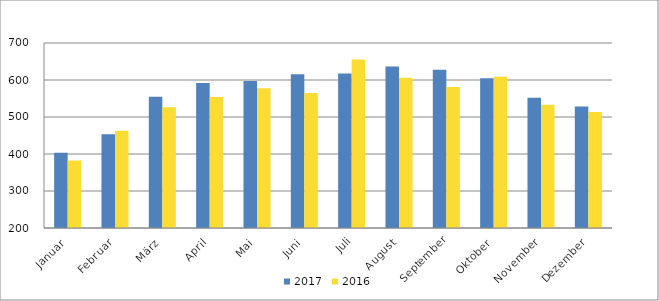
| Category | 2017 | 2016 |
|---|---|---|
| Januar | 403667 | 382236 |
| Februar | 453120 | 462901 |
| März | 555047 | 526139 |
| April | 591635 | 554241 |
| Mai | 597360 | 577989 |
| Juni | 615741 | 565043 |
| Juli | 617362 | 655533 |
| August | 636257 | 606117 |
| September | 627996 | 581178 |
| Oktober | 604529 | 608598 |
| November | 551875 | 532860 |
| Dezember | 528289 | 513236 |